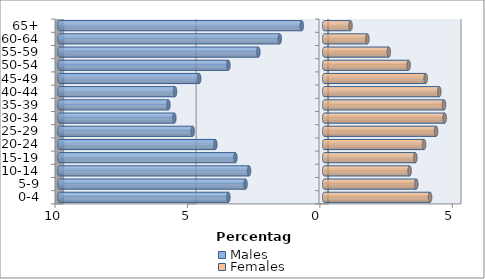
| Category | Males | Females |
|---|---|---|
| 0-4 | -3.617 | 3.997 |
| 5-9 | -2.971 | 3.477 |
| 10-14 | -2.838 | 3.225 |
| 15-19 | -3.353 | 3.44 |
| 20-24 | -4.111 | 3.77 |
| 25-29 | -4.966 | 4.224 |
| 30-34 | -5.659 | 4.548 |
| 35-39 | -5.883 | 4.523 |
| 40-44 | -5.633 | 4.345 |
| 45-49 | -4.719 | 3.83 |
| 50-54 | -3.616 | 3.185 |
| 55-59 | -2.487 | 2.438 |
| 60-64 | -1.678 | 1.628 |
| 65+ | -0.848 | 0.992 |